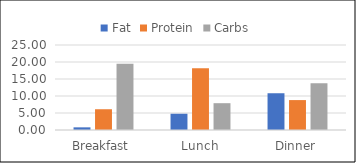
| Category | Fat | Protein | Carbs |
|---|---|---|---|
| Breakfast | 0.78 | 6.105 | 19.475 |
| Lunch | 4.78 | 18.167 | 7.887 |
| Dinner | 10.81 | 8.8 | 13.75 |